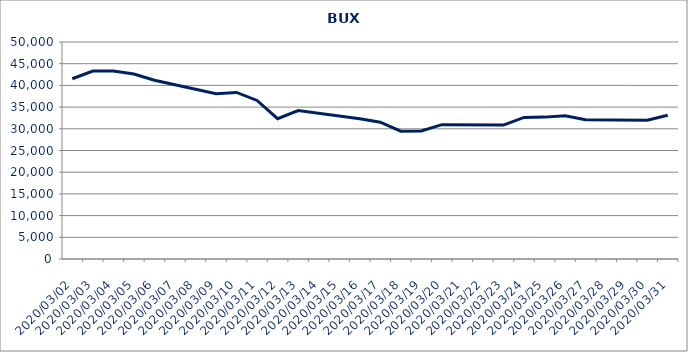
| Category | Series 0 |
|---|---|
| 2020-03-02 | 41537.199 |
| 2020-03-03 | 43301.386 |
| 2020-03-04 | 43327.916 |
| 2020-03-05 | 42607.975 |
| 2020-03-06 | 41185.289 |
| 2020-03-09 | 38075.829 |
| 2020-03-10 | 38380.597 |
| 2020-03-11 | 36536.239 |
| 2020-03-12 | 32317.889 |
| 2020-03-13 | 34189.086 |
| 2020-03-16 | 32304.48 |
| 2020-03-17 | 31525.597 |
| 2020-03-18 | 29464.278 |
| 2020-03-19 | 29494.191 |
| 2020-03-20 | 30959.94 |
| 2020-03-23 | 30848.561 |
| 2020-03-24 | 32614.556 |
| 2020-03-25 | 32690.449 |
| 2020-03-26 | 32994.297 |
| 2020-03-27 | 32065.139 |
| 2020-03-30 | 31985.326 |
| 2020-03-31 | 33134.867 |